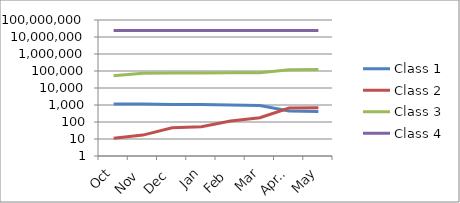
| Category | Class 1 | Class 2 | Class 3 | Class 4 |
|---|---|---|---|---|
| Oct | 1160 | 11 | 51752 | 23944918 |
| Nov | 1131 | 17 | 74030 | 23941127 |
| Dec | 1078 | 46 | 75711 | 23957573 |
| Jan | 1067 | 53 | 76685 | 23972323 |
| Feb | 990 | 115 | 78345 | 23986004 |
| Mar | 930 | 179 | 80084 | 23996449 |
| April | 449 | 663 | 119857 | 23975239 |
| May | 420 | 686 | 121241 | 23988139 |